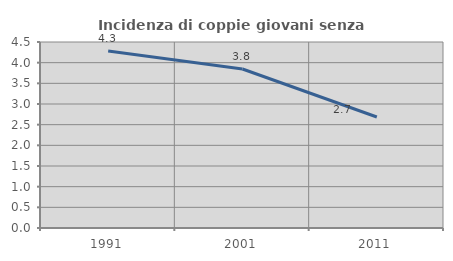
| Category | Incidenza di coppie giovani senza figli |
|---|---|
| 1991.0 | 4.283 |
| 2001.0 | 3.846 |
| 2011.0 | 2.686 |